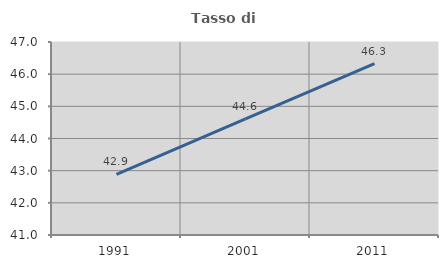
| Category | Tasso di occupazione   |
|---|---|
| 1991.0 | 42.886 |
| 2001.0 | 44.613 |
| 2011.0 | 46.329 |